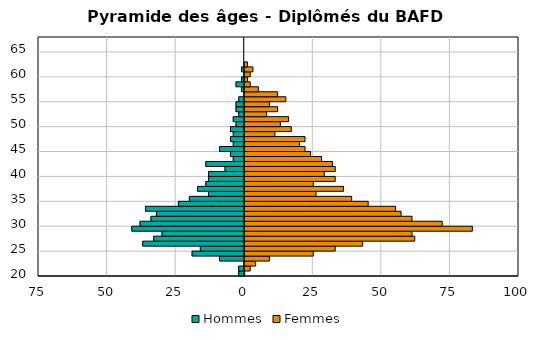
| Category | Hommes | Femmes |
|---|---|---|
| 20.0 | -2 | 0 |
| 21.0 | -2 | 2 |
| 22.0 | 0 | 4 |
| 23.0 | -9 | 9 |
| 24.0 | -19 | 25 |
| 25.0 | -16 | 33 |
| 26.0 | -37 | 43 |
| 27.0 | -33 | 62 |
| 28.0 | -30 | 61 |
| 29.0 | -41 | 83 |
| 30.0 | -38 | 72 |
| 31.0 | -34 | 61 |
| 32.0 | -32 | 57 |
| 33.0 | -36 | 55 |
| 34.0 | -24 | 45 |
| 35.0 | -20 | 39 |
| 36.0 | -13 | 26 |
| 37.0 | -17 | 36 |
| 38.0 | -14 | 25 |
| 39.0 | -13 | 33 |
| 40.0 | -13 | 29 |
| 41.0 | -7 | 33 |
| 42.0 | -14 | 32 |
| 43.0 | -4 | 28 |
| 44.0 | -5 | 24 |
| 45.0 | -9 | 22 |
| 46.0 | -4 | 20 |
| 47.0 | -5 | 22 |
| 48.0 | -4 | 11 |
| 49.0 | -5 | 17 |
| 50.0 | -3 | 13 |
| 51.0 | -4 | 16 |
| 52.0 | -2 | 8 |
| 53.0 | -3 | 12 |
| 54.0 | -3 | 9 |
| 55.0 | -2 | 15 |
| 56.0 | 0 | 12 |
| 57.0 | -1 | 5 |
| 58.0 | -3 | 2 |
| 59.0 | -1 | 1 |
| 60.0 | 0 | 2 |
| 61.0 | -1 | 3 |
| 62.0 | 0 | 1 |
| 63.0 | 0 | 0 |
| 64.0 | 0 | 0 |
| 65.0 | 0 | 0 |
| 67.0 | 0 | 0 |
| 69.0 | 0 | 0 |